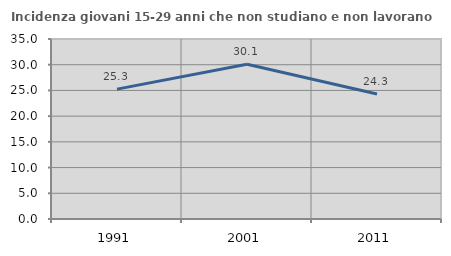
| Category | Incidenza giovani 15-29 anni che non studiano e non lavorano  |
|---|---|
| 1991.0 | 25.256 |
| 2001.0 | 30.088 |
| 2011.0 | 24.295 |